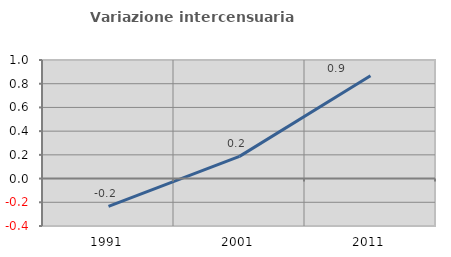
| Category | Variazione intercensuaria annua |
|---|---|
| 1991.0 | -0.234 |
| 2001.0 | 0.187 |
| 2011.0 | 0.867 |